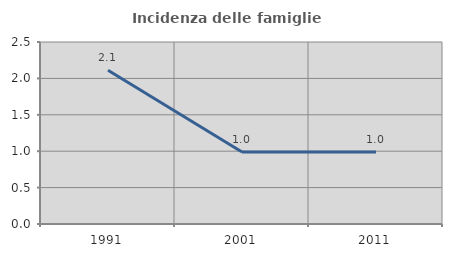
| Category | Incidenza delle famiglie numerose |
|---|---|
| 1991.0 | 2.111 |
| 2001.0 | 0.989 |
| 2011.0 | 0.988 |